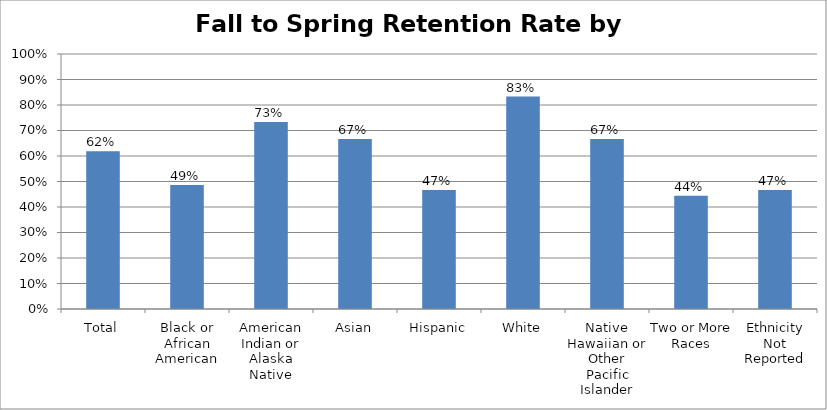
| Category | Fall to Spring Retention Rate for POS Students |
|---|---|
| Total | 0.619 |
| Black or African American | 0.486 |
| American Indian or Alaska Native | 0.733 |
| Asian | 0.667 |
| Hispanic | 0.467 |
| White | 0.833 |
| Native Hawaiian or Other Pacific Islander | 0.667 |
| Two or More Races | 0.444 |
| Ethnicity Not Reported | 0.467 |